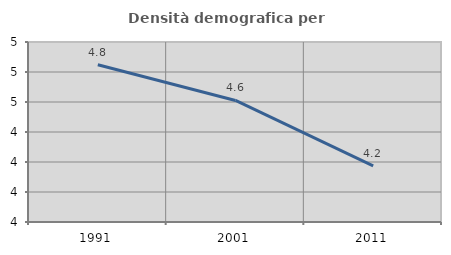
| Category | Densità demografica |
|---|---|
| 1991.0 | 4.848 |
| 2001.0 | 4.61 |
| 2011.0 | 4.174 |